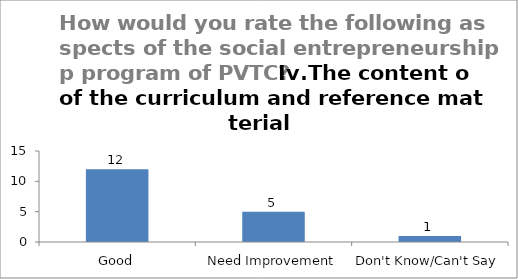
| Category | How would you rate the following aspects of the social entrepreneurship program of PVTC? Iv.The content of the curriculum and reference material  |
|---|---|
| Good | 12 |
| Need Improvement | 5 |
| Don't Know/Can't Say | 1 |